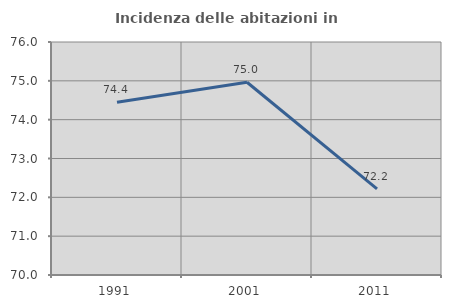
| Category | Incidenza delle abitazioni in proprietà  |
|---|---|
| 1991.0 | 74.449 |
| 2001.0 | 74.963 |
| 2011.0 | 72.22 |